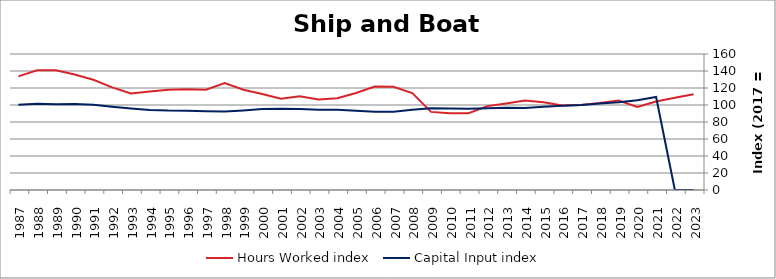
| Category | Hours Worked index | Capital Input index |
|---|---|---|
| 2023.0 | 112.586 | 0 |
| 2022.0 | 108.464 | 0 |
| 2021.0 | 104.041 | 109.392 |
| 2020.0 | 97.673 | 105.59 |
| 2019.0 | 105.319 | 103.102 |
| 2018.0 | 102.303 | 101.755 |
| 2017.0 | 100 | 100 |
| 2016.0 | 99.515 | 99.015 |
| 2015.0 | 103.291 | 97.923 |
| 2014.0 | 105.173 | 96.593 |
| 2013.0 | 101.746 | 96.761 |
| 2012.0 | 98.686 | 96.177 |
| 2011.0 | 90.322 | 95.504 |
| 2010.0 | 90.172 | 95.98 |
| 2009.0 | 91.885 | 96.225 |
| 2008.0 | 113.982 | 94.487 |
| 2007.0 | 121.445 | 92.189 |
| 2006.0 | 121.68 | 92.198 |
| 2005.0 | 114.116 | 93.319 |
| 2004.0 | 108.015 | 94.366 |
| 2003.0 | 106.473 | 94.418 |
| 2002.0 | 110.413 | 95.148 |
| 2001.0 | 107.279 | 95.708 |
| 2000.0 | 112.853 | 95.297 |
| 1999.0 | 117.879 | 93.656 |
| 1998.0 | 125.813 | 92.377 |
| 1997.0 | 117.888 | 92.768 |
| 1996.0 | 118.422 | 93.266 |
| 1995.0 | 117.974 | 93.407 |
| 1994.0 | 115.836 | 94.102 |
| 1993.0 | 113.456 | 95.812 |
| 1992.0 | 120.748 | 97.985 |
| 1991.0 | 129.629 | 100.294 |
| 1990.0 | 135.914 | 101.239 |
| 1989.0 | 140.817 | 100.947 |
| 1988.0 | 140.777 | 101.411 |
| 1987.0 | 133.65 | 100.351 |